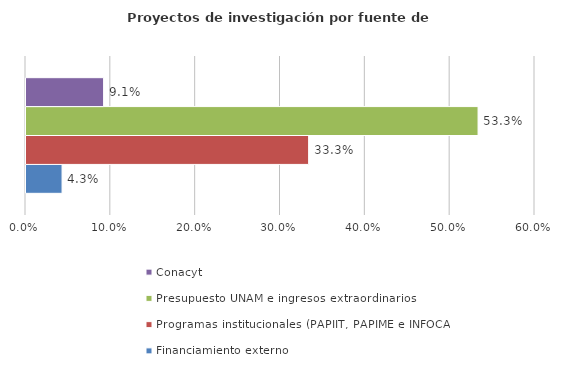
| Category | Financiamiento externo | Programas institucionales (PAPIIT, PAPIME e INFOCAB) | Presupuesto UNAM e ingresos extraordinarios | Conacyt |
|---|---|---|---|---|
| 0 | 0.043 | 0.333 | 0.533 | 0.091 |